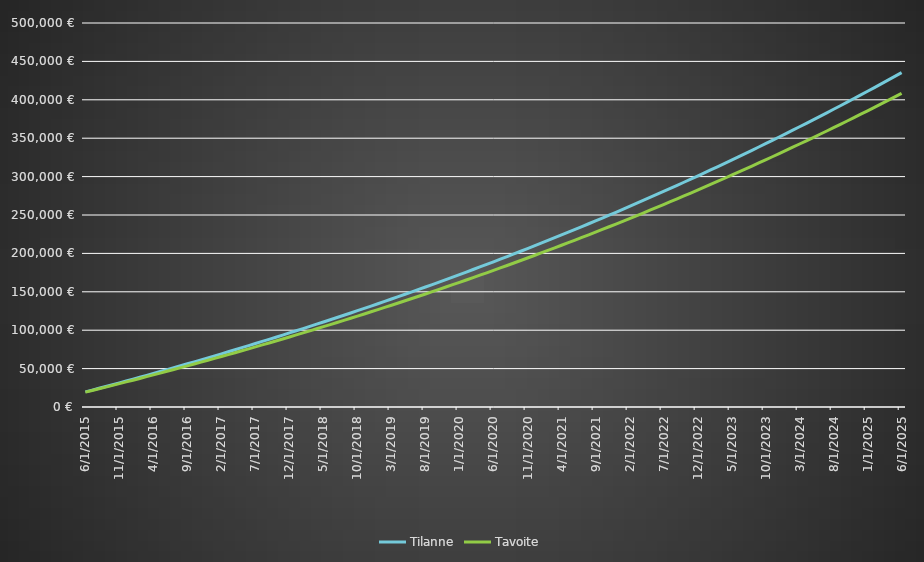
| Category | Tilanne | Tavoite |
|---|---|---|
| 6/1/15 | 19629.422 | 19332.003 |
| 7/1/15 | 21965.856 | 21518.332 |
| 8/1/15 | 24316.892 | 23718.325 |
| 9/1/15 | 26682.623 | 25932.068 |
| 10/1/15 | 29063.139 | 28159.647 |
| 11/1/15 | 31458.534 | 30401.149 |
| 12/1/15 | 33868.9 | 32656.66 |
| 1/1/16 | 36294.33 | 34926.268 |
| 2/1/16 | 38734.92 | 37210.061 |
| 3/1/16 | 41190.763 | 39508.127 |
| 4/1/16 | 43661.955 | 41820.557 |
| 5/1/16 | 46148.593 | 44147.439 |
| 6/1/16 | 48650.771 | 46488.864 |
| 7/1/16 | 51168.589 | 48844.924 |
| 8/1/16 | 53702.142 | 51215.708 |
| 9/1/16 | 56251.531 | 53601.31 |
| 10/1/16 | 58816.853 | 56001.822 |
| 11/1/16 | 61398.208 | 58417.337 |
| 12/1/16 | 63995.697 | 60847.949 |
| 1/1/17 | 66609.42 | 63293.753 |
| 2/1/17 | 69239.479 | 65754.842 |
| 3/1/17 | 71885.976 | 68231.314 |
| 4/1/17 | 74549.013 | 70723.263 |
| 5/1/17 | 77228.694 | 73230.788 |
| 6/1/17 | 79925.124 | 75753.984 |
| 7/1/17 | 82638.406 | 78292.95 |
| 8/1/17 | 85368.646 | 80847.785 |
| 9/1/17 | 88115.95 | 83418.587 |
| 10/1/17 | 90880.425 | 86005.457 |
| 11/1/17 | 93662.177 | 88608.495 |
| 12/1/17 | 96461.316 | 91227.802 |
| 1/1/18 | 99277.949 | 93863.479 |
| 2/1/18 | 102112.186 | 96515.63 |
| 3/1/18 | 104964.137 | 99184.356 |
| 4/1/18 | 107833.913 | 101869.762 |
| 5/1/18 | 110721.625 | 104571.952 |
| 6/1/18 | 113627.385 | 107291.03 |
| 7/1/18 | 116551.307 | 110027.103 |
| 8/1/18 | 119493.502 | 112780.276 |
| 9/1/18 | 122454.087 | 115550.657 |
| 10/1/18 | 125433.175 | 118338.352 |
| 11/1/18 | 128430.882 | 121143.471 |
| 12/1/18 | 131447.325 | 123966.121 |
| 1/1/19 | 134482.621 | 126806.413 |
| 2/1/19 | 137536.887 | 129664.457 |
| 3/1/19 | 140610.243 | 132540.364 |
| 4/1/19 | 143702.807 | 135434.245 |
| 5/1/19 | 146814.699 | 138346.212 |
| 6/1/19 | 149946.041 | 141276.38 |
| 7/1/19 | 153096.954 | 144224.861 |
| 8/1/19 | 156267.56 | 147191.77 |
| 9/1/19 | 159457.982 | 150177.223 |
| 10/1/19 | 162668.344 | 153181.334 |
| 11/1/19 | 165898.772 | 156204.221 |
| 12/1/19 | 169149.389 | 159246.001 |
| 1/1/20 | 172420.323 | 162306.792 |
| 2/1/20 | 175711.7 | 165386.714 |
| 3/1/20 | 179023.648 | 168485.884 |
| 4/1/20 | 182356.296 | 171604.425 |
| 5/1/20 | 185709.772 | 174742.456 |
| 6/1/20 | 189084.208 | 177900.1 |
| 7/1/20 | 192479.735 | 181077.48 |
| 8/1/20 | 195896.483 | 184274.718 |
| 9/1/20 | 199334.586 | 187491.939 |
| 10/1/20 | 202794.177 | 190729.267 |
| 11/1/20 | 206275.391 | 193986.829 |
| 12/1/20 | 209778.362 | 197264.75 |
| 1/1/21 | 213303.227 | 200563.159 |
| 2/1/21 | 216850.122 | 203882.182 |
| 3/1/21 | 220419.185 | 207221.949 |
| 4/1/21 | 224010.555 | 210582.59 |
| 5/1/21 | 227624.371 | 213964.235 |
| 6/1/21 | 231260.773 | 217367.016 |
| 7/1/21 | 234919.903 | 220791.063 |
| 8/1/21 | 238601.903 | 224236.511 |
| 9/1/21 | 242306.915 | 227703.493 |
| 10/1/21 | 246035.083 | 231192.144 |
| 11/1/21 | 249786.552 | 234702.598 |
| 12/1/21 | 253561.468 | 238234.993 |
| 1/1/22 | 257359.977 | 241789.466 |
| 2/1/22 | 261182.227 | 245366.154 |
| 3/1/22 | 265028.366 | 248965.196 |
| 4/1/22 | 268898.543 | 252586.732 |
| 5/1/22 | 272792.909 | 256230.903 |
| 6/1/22 | 276711.615 | 259897.85 |
| 7/1/22 | 280654.812 | 263587.715 |
| 8/1/22 | 284622.655 | 267300.642 |
| 9/1/22 | 288615.297 | 271036.775 |
| 10/1/22 | 292632.892 | 274796.259 |
| 11/1/22 | 296675.598 | 278579.239 |
| 12/1/22 | 300743.57 | 282385.863 |
| 1/1/23 | 304836.968 | 286216.278 |
| 2/1/23 | 308955.949 | 290070.634 |
| 3/1/23 | 313100.673 | 293949.079 |
| 4/1/23 | 317271.303 | 297851.765 |
| 5/1/23 | 321467.998 | 301778.842 |
| 6/1/23 | 325690.923 | 305730.463 |
| 7/1/23 | 329940.241 | 309706.783 |
| 8/1/23 | 334216.118 | 313707.954 |
| 9/1/23 | 338518.719 | 317734.132 |
| 10/1/23 | 342848.211 | 321785.474 |
| 11/1/23 | 347204.762 | 325862.137 |
| 12/1/23 | 351588.542 | 329964.279 |
| 1/1/24 | 355999.72 | 334092.06 |
| 2/1/24 | 360438.468 | 338245.639 |
| 3/1/24 | 364904.959 | 342425.178 |
| 4/1/24 | 369399.365 | 346630.839 |
| 5/1/24 | 373921.861 | 350862.786 |
| 6/1/24 | 378472.622 | 355121.182 |
| 7/1/24 | 383051.826 | 359406.193 |
| 8/1/24 | 387659.65 | 363717.985 |
| 9/1/24 | 392296.273 | 368056.727 |
| 10/1/24 | 396961.875 | 372422.585 |
| 11/1/24 | 401656.637 | 376815.73 |
| 12/1/24 | 406380.74 | 381236.332 |
| 1/1/25 | 411134.37 | 385684.563 |
| 2/1/25 | 415917.71 | 390160.595 |
| 3/1/25 | 420730.946 | 394664.603 |
| 4/1/25 | 425574.264 | 399196.76 |
| 5/1/25 | 430447.853 | 403757.244 |
| 6/1/25 | 435351.902 | 408346.23 |